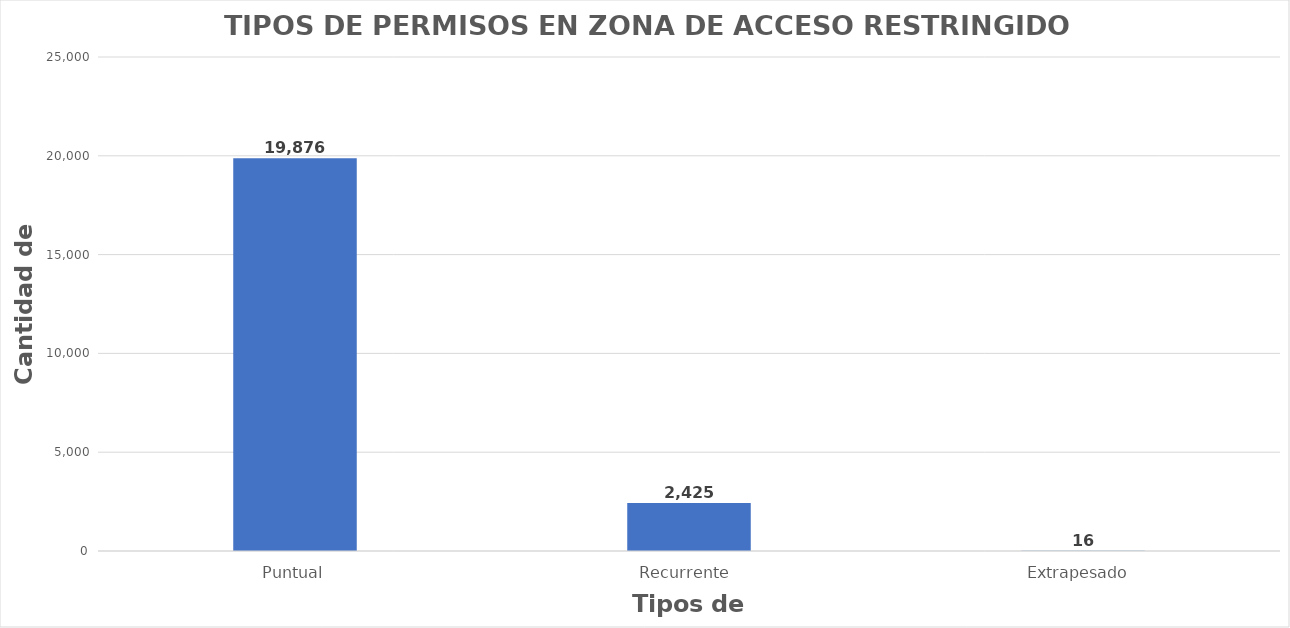
| Category | Series 0 |
|---|---|
| Puntual | 19876 |
| Recurrente  | 2425 |
| Extrapesado  | 16 |